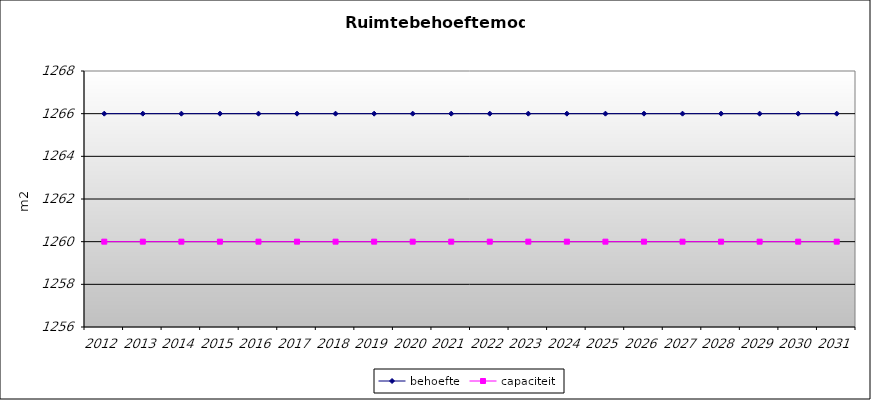
| Category | behoefte | capaciteit |
|---|---|---|
| 2012.0 | 1266 | 1260 |
| 2013.0 | 1266 | 1260 |
| 2014.0 | 1266 | 1260 |
| 2015.0 | 1266 | 1260 |
| 2016.0 | 1266 | 1260 |
| 2017.0 | 1266 | 1260 |
| 2018.0 | 1266 | 1260 |
| 2019.0 | 1266 | 1260 |
| 2020.0 | 1266 | 1260 |
| 2021.0 | 1266 | 1260 |
| 2022.0 | 1266 | 1260 |
| 2023.0 | 1266 | 1260 |
| 2024.0 | 1266 | 1260 |
| 2025.0 | 1266 | 1260 |
| 2026.0 | 1266 | 1260 |
| 2027.0 | 1266 | 1260 |
| 2028.0 | 1266 | 1260 |
| 2029.0 | 1266 | 1260 |
| 2030.0 | 1266 | 1260 |
| 2031.0 | 1266 | 1260 |